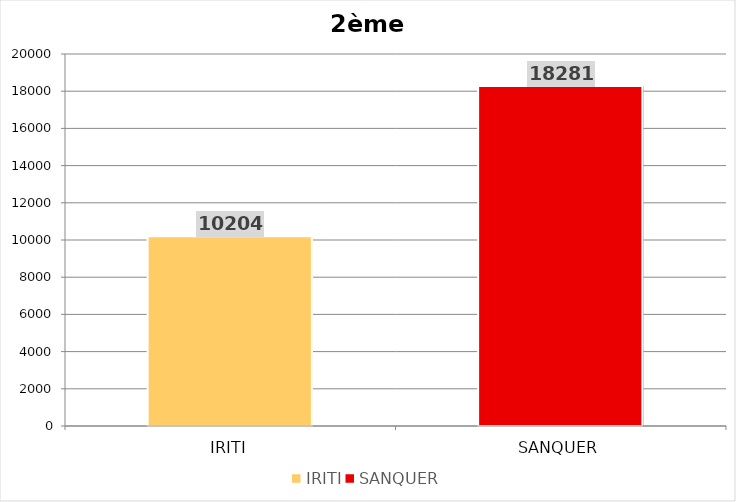
| Category | Series 0 |
|---|---|
| IRITI | 10204 |
| SANQUER | 18281 |